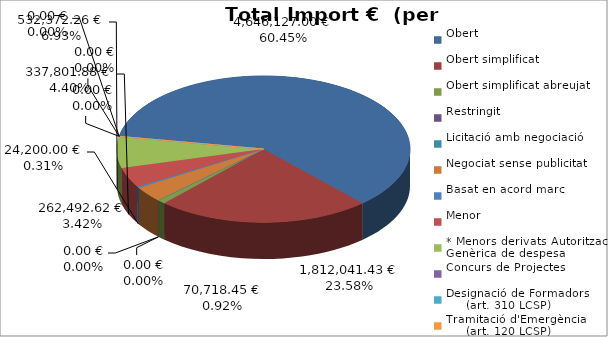
| Category | Total preu
(amb IVA) |
|---|---|
| Obert | 4646127 |
| Obert simplificat | 1812041.43 |
| Obert simplificat abreujat | 70718.45 |
| Restringit | 0 |
| Licitació amb negociació | 0 |
| Negociat sense publicitat | 262492.62 |
| Basat en acord marc | 24200 |
| Menor | 337801.88 |
| * Menors derivats Autorització Genèrica de despesa | 532372.26 |
| Concurs de Projectes | 0 |
| Designació de Formadors
     (art. 310 LCSP) | 0 |
| Tramitació d'Emergència
     (art. 120 LCSP) | 0 |